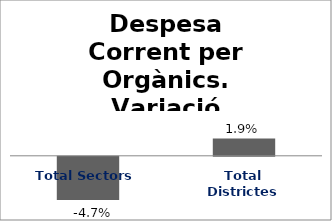
| Category | Series 0 |
|---|---|
| Total Sectors | -0.047 |
| Total Districtes | 0.019 |